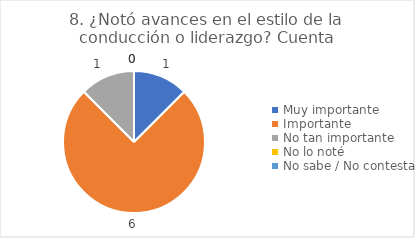
| Category | 8. ¿Notó avances en el estilo de la conducción o liderazgo? |
|---|---|
| Muy importante  | 0.125 |
| Importante  | 0.75 |
| No tan importante  | 0.125 |
| No lo noté  | 0 |
| No sabe / No contesta | 0 |